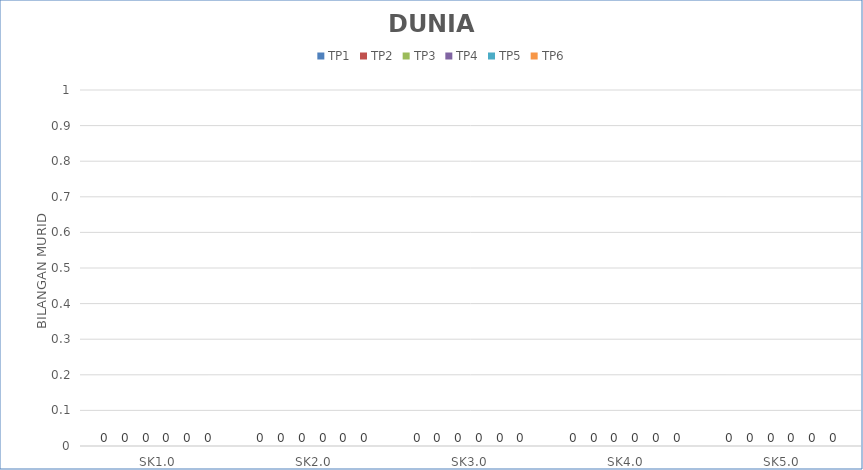
| Category | TP1 | TP2 | TP3 | TP4 | TP5 | TP6 |
|---|---|---|---|---|---|---|
| SK1.0 | 0 | 0 | 0 | 0 | 0 | 0 |
| SK2.0 | 0 | 0 | 0 | 0 | 0 | 0 |
| SK3.0 | 0 | 0 | 0 | 0 | 0 | 0 |
| SK4.0 | 0 | 0 | 0 | 0 | 0 | 0 |
| SK5.0 | 0 | 0 | 0 | 0 | 0 | 0 |